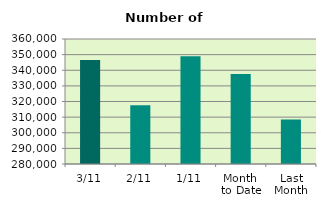
| Category | Series 0 |
|---|---|
| 3/11 | 346550 |
| 2/11 | 317576 |
| 1/11 | 348902 |
| Month 
to Date | 337676 |
| Last
Month | 308508.19 |